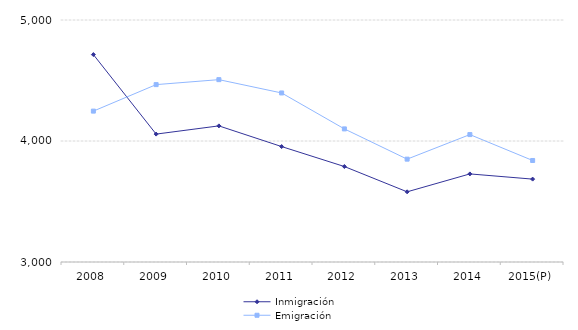
| Category | Inmigración | Emigración |
|---|---|---|
| 2008 | 4714 | 4247 |
| 2009 | 4057 | 4466 |
| 2010 | 4125 | 4507 |
| 2011 | 3954 | 4397 |
| 2012 | 3789 | 4100 |
| 2013 | 3580 | 3850 |
| 2014 | 3728 | 4053 |
| 2015(P) | 3685 | 3839 |